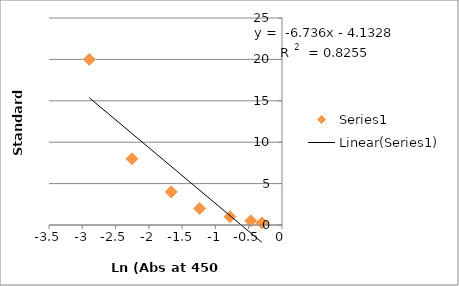
| Category | Series 0 |
|---|---|
| -2.894379779293704 | 20 |
| -2.253794928824613 | 8 |
| -1.664246148929095 | 4 |
| -1.236725590797744 | 2 |
| -0.782342759364416 | 1 |
| -0.469470438084077 | 0.5 |
| -0.301105092783922 | 0.25 |